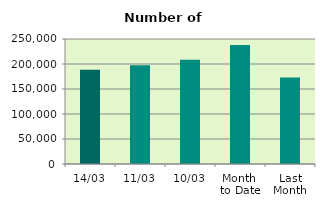
| Category | Series 0 |
|---|---|
| 14/03 | 188362 |
| 11/03 | 197532 |
| 10/03 | 208748 |
| Month 
to Date | 238042.2 |
| Last
Month | 173197.3 |